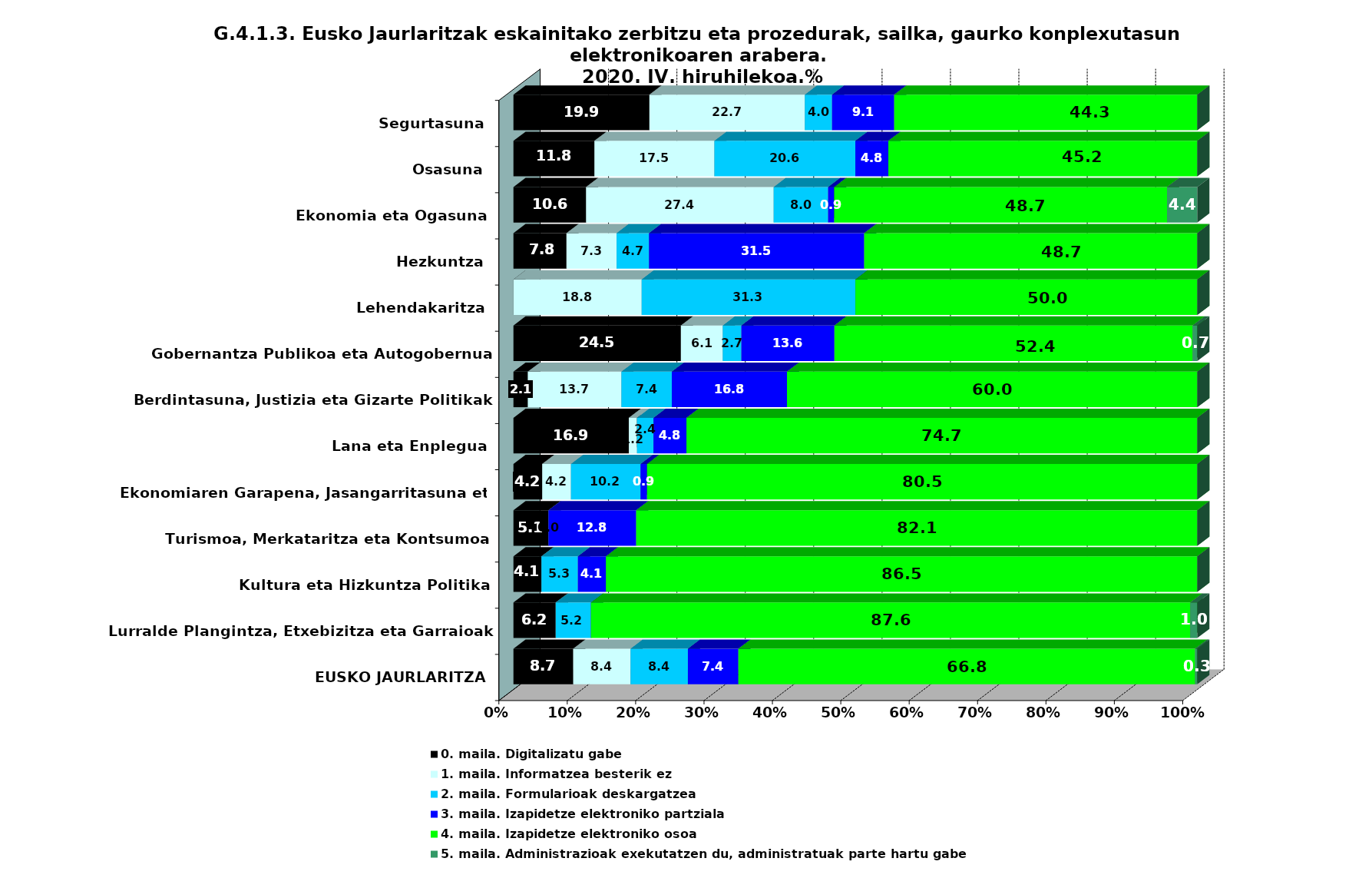
| Category | 0. maila. Digitalizatu gabe | 1. maila. Informatzea besterik ez | 2. maila. Formularioak deskargatzea | 3. maila. Izapidetze elektroniko partziala | 4. maila. Izapidetze elektroniko osoa | 5. maila. Administrazioak exekutatzen du, administratuak parte hartu gabe |
|---|---|---|---|---|---|---|
| EUSKO JAURLARITZA | 8.745 | 8.382 | 8.382 | 7.386 | 66.787 | 0.317 |
| Lurralde Plangintza, Etxebizitza eta Garraioak | 6.186 | 0 | 5.155 | 0 | 87.629 | 1.031 |
| Kultura eta Hizkuntza Politika | 4.098 | 0 | 5.328 | 4.098 | 86.475 | 0 |
| Turismoa, Merkataritza eta Kontsumoa | 5.128 | 0 | 0 | 12.821 | 82.051 | 0 |
| Ekonomiaren Garapena, Jasangarritasuna eta Ingurumena | 4.206 | 4.206 | 10.176 | 0.95 | 80.461 | 0 |
| Lana eta Enplegua | 16.867 | 1.205 | 2.41 | 4.819 | 74.699 | 0 |
| Berdintasuna, Justizia eta Gizarte Politikak | 2.105 | 13.684 | 7.368 | 16.842 | 60 | 0 |
| Gobernantza Publikoa eta Autogobernua | 24.49 | 6.122 | 2.721 | 13.605 | 52.381 | 0.68 |
| Lehendakaritza | 0 | 18.75 | 31.25 | 0 | 50 | 0 |
| Hezkuntza | 7.759 | 7.328 | 4.741 | 31.466 | 48.707 | 0 |
| Ekonomia eta Ogasuna | 10.619 | 27.434 | 7.965 | 0.885 | 48.673 | 4.425 |
| Osasuna | 11.842 | 17.544 | 20.614 | 4.825 | 45.175 | 0 |
| Segurtasuna | 19.886 | 22.727 | 3.977 | 9.091 | 44.318 | 0 |